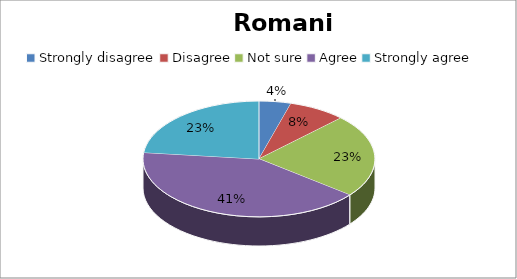
| Category | Series 0 |
|---|---|
| Strongly disagree | 5 |
| Disagree | 9 |
| Not sure | 26 |
| Agree | 46 |
| Strongly agree | 26 |